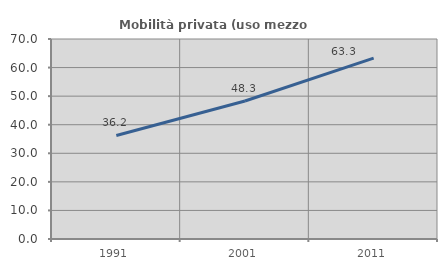
| Category | Mobilità privata (uso mezzo privato) |
|---|---|
| 1991.0 | 36.228 |
| 2001.0 | 48.293 |
| 2011.0 | 63.304 |